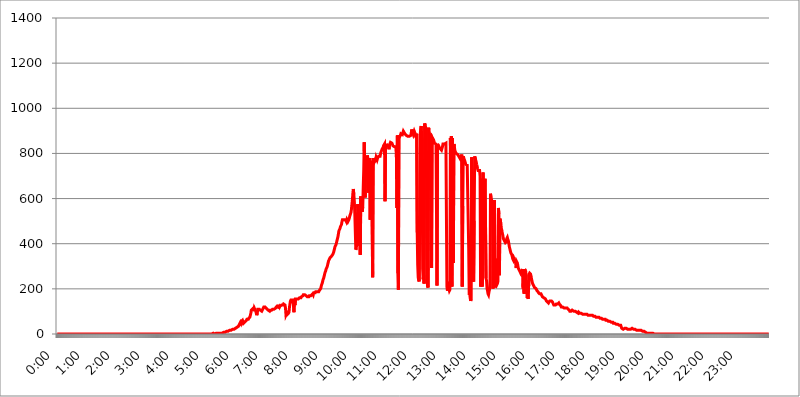
| Category | 2017.07.28. Intenzitás [W/m^2] |
|---|---|
| 0.0 | 0 |
| 0.0006944444444444445 | 0 |
| 0.001388888888888889 | 0 |
| 0.0020833333333333333 | 0 |
| 0.002777777777777778 | 0 |
| 0.003472222222222222 | 0 |
| 0.004166666666666667 | 0 |
| 0.004861111111111111 | 0 |
| 0.005555555555555556 | 0 |
| 0.0062499999999999995 | 0 |
| 0.006944444444444444 | 0 |
| 0.007638888888888889 | 0 |
| 0.008333333333333333 | 0 |
| 0.009027777777777779 | 0 |
| 0.009722222222222222 | 0 |
| 0.010416666666666666 | 0 |
| 0.011111111111111112 | 0 |
| 0.011805555555555555 | 0 |
| 0.012499999999999999 | 0 |
| 0.013194444444444444 | 0 |
| 0.013888888888888888 | 0 |
| 0.014583333333333332 | 0 |
| 0.015277777777777777 | 0 |
| 0.015972222222222224 | 0 |
| 0.016666666666666666 | 0 |
| 0.017361111111111112 | 0 |
| 0.018055555555555557 | 0 |
| 0.01875 | 0 |
| 0.019444444444444445 | 0 |
| 0.02013888888888889 | 0 |
| 0.020833333333333332 | 0 |
| 0.02152777777777778 | 0 |
| 0.022222222222222223 | 0 |
| 0.02291666666666667 | 0 |
| 0.02361111111111111 | 0 |
| 0.024305555555555556 | 0 |
| 0.024999999999999998 | 0 |
| 0.025694444444444447 | 0 |
| 0.02638888888888889 | 0 |
| 0.027083333333333334 | 0 |
| 0.027777777777777776 | 0 |
| 0.02847222222222222 | 0 |
| 0.029166666666666664 | 0 |
| 0.029861111111111113 | 0 |
| 0.030555555555555555 | 0 |
| 0.03125 | 0 |
| 0.03194444444444445 | 0 |
| 0.03263888888888889 | 0 |
| 0.03333333333333333 | 0 |
| 0.034027777777777775 | 0 |
| 0.034722222222222224 | 0 |
| 0.035416666666666666 | 0 |
| 0.036111111111111115 | 0 |
| 0.03680555555555556 | 0 |
| 0.0375 | 0 |
| 0.03819444444444444 | 0 |
| 0.03888888888888889 | 0 |
| 0.03958333333333333 | 0 |
| 0.04027777777777778 | 0 |
| 0.04097222222222222 | 0 |
| 0.041666666666666664 | 0 |
| 0.042361111111111106 | 0 |
| 0.04305555555555556 | 0 |
| 0.043750000000000004 | 0 |
| 0.044444444444444446 | 0 |
| 0.04513888888888889 | 0 |
| 0.04583333333333334 | 0 |
| 0.04652777777777778 | 0 |
| 0.04722222222222222 | 0 |
| 0.04791666666666666 | 0 |
| 0.04861111111111111 | 0 |
| 0.049305555555555554 | 0 |
| 0.049999999999999996 | 0 |
| 0.05069444444444445 | 0 |
| 0.051388888888888894 | 0 |
| 0.052083333333333336 | 0 |
| 0.05277777777777778 | 0 |
| 0.05347222222222222 | 0 |
| 0.05416666666666667 | 0 |
| 0.05486111111111111 | 0 |
| 0.05555555555555555 | 0 |
| 0.05625 | 0 |
| 0.05694444444444444 | 0 |
| 0.057638888888888885 | 0 |
| 0.05833333333333333 | 0 |
| 0.05902777777777778 | 0 |
| 0.059722222222222225 | 0 |
| 0.06041666666666667 | 0 |
| 0.061111111111111116 | 0 |
| 0.06180555555555556 | 0 |
| 0.0625 | 0 |
| 0.06319444444444444 | 0 |
| 0.06388888888888888 | 0 |
| 0.06458333333333334 | 0 |
| 0.06527777777777778 | 0 |
| 0.06597222222222222 | 0 |
| 0.06666666666666667 | 0 |
| 0.06736111111111111 | 0 |
| 0.06805555555555555 | 0 |
| 0.06874999999999999 | 0 |
| 0.06944444444444443 | 0 |
| 0.07013888888888889 | 0 |
| 0.07083333333333333 | 0 |
| 0.07152777777777779 | 0 |
| 0.07222222222222223 | 0 |
| 0.07291666666666667 | 0 |
| 0.07361111111111111 | 0 |
| 0.07430555555555556 | 0 |
| 0.075 | 0 |
| 0.07569444444444444 | 0 |
| 0.0763888888888889 | 0 |
| 0.07708333333333334 | 0 |
| 0.07777777777777778 | 0 |
| 0.07847222222222222 | 0 |
| 0.07916666666666666 | 0 |
| 0.0798611111111111 | 0 |
| 0.08055555555555556 | 0 |
| 0.08125 | 0 |
| 0.08194444444444444 | 0 |
| 0.08263888888888889 | 0 |
| 0.08333333333333333 | 0 |
| 0.08402777777777777 | 0 |
| 0.08472222222222221 | 0 |
| 0.08541666666666665 | 0 |
| 0.08611111111111112 | 0 |
| 0.08680555555555557 | 0 |
| 0.08750000000000001 | 0 |
| 0.08819444444444445 | 0 |
| 0.08888888888888889 | 0 |
| 0.08958333333333333 | 0 |
| 0.09027777777777778 | 0 |
| 0.09097222222222222 | 0 |
| 0.09166666666666667 | 0 |
| 0.09236111111111112 | 0 |
| 0.09305555555555556 | 0 |
| 0.09375 | 0 |
| 0.09444444444444444 | 0 |
| 0.09513888888888888 | 0 |
| 0.09583333333333333 | 0 |
| 0.09652777777777777 | 0 |
| 0.09722222222222222 | 0 |
| 0.09791666666666667 | 0 |
| 0.09861111111111111 | 0 |
| 0.09930555555555555 | 0 |
| 0.09999999999999999 | 0 |
| 0.10069444444444443 | 0 |
| 0.1013888888888889 | 0 |
| 0.10208333333333335 | 0 |
| 0.10277777777777779 | 0 |
| 0.10347222222222223 | 0 |
| 0.10416666666666667 | 0 |
| 0.10486111111111111 | 0 |
| 0.10555555555555556 | 0 |
| 0.10625 | 0 |
| 0.10694444444444444 | 0 |
| 0.1076388888888889 | 0 |
| 0.10833333333333334 | 0 |
| 0.10902777777777778 | 0 |
| 0.10972222222222222 | 0 |
| 0.1111111111111111 | 0 |
| 0.11180555555555556 | 0 |
| 0.11180555555555556 | 0 |
| 0.1125 | 0 |
| 0.11319444444444444 | 0 |
| 0.11388888888888889 | 0 |
| 0.11458333333333333 | 0 |
| 0.11527777777777777 | 0 |
| 0.11597222222222221 | 0 |
| 0.11666666666666665 | 0 |
| 0.1173611111111111 | 0 |
| 0.11805555555555557 | 0 |
| 0.11944444444444445 | 0 |
| 0.12013888888888889 | 0 |
| 0.12083333333333333 | 0 |
| 0.12152777777777778 | 0 |
| 0.12222222222222223 | 0 |
| 0.12291666666666667 | 0 |
| 0.12291666666666667 | 0 |
| 0.12361111111111112 | 0 |
| 0.12430555555555556 | 0 |
| 0.125 | 0 |
| 0.12569444444444444 | 0 |
| 0.12638888888888888 | 0 |
| 0.12708333333333333 | 0 |
| 0.16875 | 0 |
| 0.12847222222222224 | 0 |
| 0.12916666666666668 | 0 |
| 0.12986111111111112 | 0 |
| 0.13055555555555556 | 0 |
| 0.13125 | 0 |
| 0.13194444444444445 | 0 |
| 0.1326388888888889 | 0 |
| 0.13333333333333333 | 0 |
| 0.13402777777777777 | 0 |
| 0.13402777777777777 | 0 |
| 0.13472222222222222 | 0 |
| 0.13541666666666666 | 0 |
| 0.1361111111111111 | 0 |
| 0.13749999999999998 | 0 |
| 0.13819444444444443 | 0 |
| 0.1388888888888889 | 0 |
| 0.13958333333333334 | 0 |
| 0.14027777777777778 | 0 |
| 0.14097222222222222 | 0 |
| 0.14166666666666666 | 0 |
| 0.1423611111111111 | 0 |
| 0.14305555555555557 | 0 |
| 0.14375000000000002 | 0 |
| 0.14444444444444446 | 0 |
| 0.1451388888888889 | 0 |
| 0.1451388888888889 | 0 |
| 0.14652777777777778 | 0 |
| 0.14722222222222223 | 0 |
| 0.14791666666666667 | 0 |
| 0.1486111111111111 | 0 |
| 0.14930555555555555 | 0 |
| 0.15 | 0 |
| 0.15069444444444444 | 0 |
| 0.15138888888888888 | 0 |
| 0.15208333333333332 | 0 |
| 0.15277777777777776 | 0 |
| 0.15347222222222223 | 0 |
| 0.15416666666666667 | 0 |
| 0.15486111111111112 | 0 |
| 0.15555555555555556 | 0 |
| 0.15625 | 0 |
| 0.15694444444444444 | 0 |
| 0.15763888888888888 | 0 |
| 0.15833333333333333 | 0 |
| 0.15902777777777777 | 0 |
| 0.15972222222222224 | 0 |
| 0.16041666666666668 | 0 |
| 0.16111111111111112 | 0 |
| 0.16180555555555556 | 0 |
| 0.1625 | 0 |
| 0.16319444444444445 | 0 |
| 0.1638888888888889 | 0 |
| 0.16458333333333333 | 0 |
| 0.16527777777777777 | 0 |
| 0.16597222222222222 | 0 |
| 0.16666666666666666 | 0 |
| 0.1673611111111111 | 0 |
| 0.16805555555555554 | 0 |
| 0.16874999999999998 | 0 |
| 0.16944444444444443 | 0 |
| 0.17013888888888887 | 0 |
| 0.1708333333333333 | 0 |
| 0.17152777777777775 | 0 |
| 0.17222222222222225 | 0 |
| 0.1729166666666667 | 0 |
| 0.17361111111111113 | 0 |
| 0.17430555555555557 | 0 |
| 0.17500000000000002 | 0 |
| 0.17569444444444446 | 0 |
| 0.1763888888888889 | 0 |
| 0.17708333333333334 | 0 |
| 0.17777777777777778 | 0 |
| 0.17847222222222223 | 0 |
| 0.17916666666666667 | 0 |
| 0.1798611111111111 | 0 |
| 0.18055555555555555 | 0 |
| 0.18125 | 0 |
| 0.18194444444444444 | 0 |
| 0.1826388888888889 | 0 |
| 0.18333333333333335 | 0 |
| 0.1840277777777778 | 0 |
| 0.18472222222222223 | 0 |
| 0.18541666666666667 | 0 |
| 0.18611111111111112 | 0 |
| 0.18680555555555556 | 0 |
| 0.1875 | 0 |
| 0.18819444444444444 | 0 |
| 0.18888888888888888 | 0 |
| 0.18958333333333333 | 0 |
| 0.19027777777777777 | 0 |
| 0.1909722222222222 | 0 |
| 0.19166666666666665 | 0 |
| 0.19236111111111112 | 0 |
| 0.19305555555555554 | 0 |
| 0.19375 | 0 |
| 0.19444444444444445 | 0 |
| 0.1951388888888889 | 0 |
| 0.19583333333333333 | 0 |
| 0.19652777777777777 | 0 |
| 0.19722222222222222 | 0 |
| 0.19791666666666666 | 0 |
| 0.1986111111111111 | 0 |
| 0.19930555555555554 | 0 |
| 0.19999999999999998 | 0 |
| 0.20069444444444443 | 0 |
| 0.20138888888888887 | 0 |
| 0.2020833333333333 | 0 |
| 0.2027777777777778 | 0 |
| 0.2034722222222222 | 0 |
| 0.2041666666666667 | 0 |
| 0.20486111111111113 | 0 |
| 0.20555555555555557 | 0 |
| 0.20625000000000002 | 0 |
| 0.20694444444444446 | 0 |
| 0.2076388888888889 | 0 |
| 0.20833333333333334 | 0 |
| 0.20902777777777778 | 0 |
| 0.20972222222222223 | 0 |
| 0.21041666666666667 | 0 |
| 0.2111111111111111 | 0 |
| 0.21180555555555555 | 0 |
| 0.2125 | 0 |
| 0.21319444444444444 | 0 |
| 0.2138888888888889 | 0 |
| 0.21458333333333335 | 0 |
| 0.2152777777777778 | 0 |
| 0.21597222222222223 | 3.525 |
| 0.21666666666666667 | 0 |
| 0.21736111111111112 | 0 |
| 0.21805555555555556 | 0 |
| 0.21875 | 3.525 |
| 0.21944444444444444 | 3.525 |
| 0.22013888888888888 | 0 |
| 0.22083333333333333 | 0 |
| 0.22152777777777777 | 0 |
| 0.2222222222222222 | 0 |
| 0.22291666666666665 | 3.525 |
| 0.2236111111111111 | 3.525 |
| 0.22430555555555556 | 3.525 |
| 0.225 | 3.525 |
| 0.22569444444444445 | 3.525 |
| 0.2263888888888889 | 3.525 |
| 0.22708333333333333 | 3.525 |
| 0.22777777777777777 | 3.525 |
| 0.22847222222222222 | 3.525 |
| 0.22916666666666666 | 3.525 |
| 0.2298611111111111 | 3.525 |
| 0.23055555555555554 | 3.525 |
| 0.23124999999999998 | 3.525 |
| 0.23194444444444443 | 7.887 |
| 0.23263888888888887 | 7.887 |
| 0.2333333333333333 | 7.887 |
| 0.2340277777777778 | 7.887 |
| 0.2347222222222222 | 7.887 |
| 0.2354166666666667 | 7.887 |
| 0.23611111111111113 | 12.257 |
| 0.23680555555555557 | 12.257 |
| 0.23750000000000002 | 12.257 |
| 0.23819444444444446 | 12.257 |
| 0.2388888888888889 | 12.257 |
| 0.23958333333333334 | 12.257 |
| 0.24027777777777778 | 12.257 |
| 0.24097222222222223 | 12.257 |
| 0.24166666666666667 | 16.636 |
| 0.2423611111111111 | 16.636 |
| 0.24305555555555555 | 16.636 |
| 0.24375 | 16.636 |
| 0.24444444444444446 | 21.024 |
| 0.24513888888888888 | 21.024 |
| 0.24583333333333335 | 21.024 |
| 0.2465277777777778 | 21.024 |
| 0.24722222222222223 | 21.024 |
| 0.24791666666666667 | 21.024 |
| 0.24861111111111112 | 25.419 |
| 0.24930555555555556 | 25.419 |
| 0.25 | 25.419 |
| 0.25069444444444444 | 25.419 |
| 0.2513888888888889 | 29.823 |
| 0.2520833333333333 | 29.823 |
| 0.25277777777777777 | 29.823 |
| 0.2534722222222222 | 29.823 |
| 0.25416666666666665 | 34.234 |
| 0.2548611111111111 | 34.234 |
| 0.2555555555555556 | 43.079 |
| 0.25625000000000003 | 43.079 |
| 0.2569444444444445 | 51.951 |
| 0.2576388888888889 | 47.511 |
| 0.25833333333333336 | 56.398 |
| 0.2590277777777778 | 56.398 |
| 0.25972222222222224 | 60.85 |
| 0.2604166666666667 | 60.85 |
| 0.2611111111111111 | 47.511 |
| 0.26180555555555557 | 47.511 |
| 0.2625 | 51.951 |
| 0.26319444444444445 | 51.951 |
| 0.2638888888888889 | 56.398 |
| 0.26458333333333334 | 56.398 |
| 0.2652777777777778 | 60.85 |
| 0.2659722222222222 | 65.31 |
| 0.26666666666666666 | 65.31 |
| 0.2673611111111111 | 65.31 |
| 0.26805555555555555 | 65.31 |
| 0.26875 | 69.775 |
| 0.26944444444444443 | 69.775 |
| 0.2701388888888889 | 74.246 |
| 0.2708333333333333 | 83.205 |
| 0.27152777777777776 | 92.184 |
| 0.2722222222222222 | 105.69 |
| 0.27291666666666664 | 105.69 |
| 0.2736111111111111 | 110.201 |
| 0.2743055555555555 | 110.201 |
| 0.27499999999999997 | 114.716 |
| 0.27569444444444446 | 101.184 |
| 0.27638888888888885 | 114.716 |
| 0.27708333333333335 | 114.716 |
| 0.2777777777777778 | 114.716 |
| 0.27847222222222223 | 101.184 |
| 0.2791666666666667 | 92.184 |
| 0.2798611111111111 | 83.205 |
| 0.28055555555555556 | 92.184 |
| 0.28125 | 110.201 |
| 0.28194444444444444 | 110.201 |
| 0.2826388888888889 | 110.201 |
| 0.2833333333333333 | 110.201 |
| 0.28402777777777777 | 110.201 |
| 0.2847222222222222 | 105.69 |
| 0.28541666666666665 | 105.69 |
| 0.28611111111111115 | 105.69 |
| 0.28680555555555554 | 101.184 |
| 0.28750000000000003 | 105.69 |
| 0.2881944444444445 | 110.201 |
| 0.2888888888888889 | 114.716 |
| 0.28958333333333336 | 119.235 |
| 0.2902777777777778 | 119.235 |
| 0.29097222222222224 | 119.235 |
| 0.2916666666666667 | 119.235 |
| 0.2923611111111111 | 119.235 |
| 0.29305555555555557 | 114.716 |
| 0.29375 | 114.716 |
| 0.29444444444444445 | 110.201 |
| 0.2951388888888889 | 110.201 |
| 0.29583333333333334 | 105.69 |
| 0.2965277777777778 | 105.69 |
| 0.2972222222222222 | 105.69 |
| 0.29791666666666666 | 101.184 |
| 0.2986111111111111 | 105.69 |
| 0.29930555555555555 | 105.69 |
| 0.3 | 105.69 |
| 0.30069444444444443 | 105.69 |
| 0.3013888888888889 | 105.69 |
| 0.3020833333333333 | 110.201 |
| 0.30277777777777776 | 110.201 |
| 0.3034722222222222 | 110.201 |
| 0.30416666666666664 | 110.201 |
| 0.3048611111111111 | 110.201 |
| 0.3055555555555555 | 110.201 |
| 0.30624999999999997 | 114.716 |
| 0.3069444444444444 | 119.235 |
| 0.3076388888888889 | 119.235 |
| 0.30833333333333335 | 123.758 |
| 0.3090277777777778 | 123.758 |
| 0.30972222222222223 | 119.235 |
| 0.3104166666666667 | 119.235 |
| 0.3111111111111111 | 123.758 |
| 0.31180555555555556 | 119.235 |
| 0.3125 | 123.758 |
| 0.31319444444444444 | 123.758 |
| 0.3138888888888889 | 123.758 |
| 0.3145833333333333 | 128.284 |
| 0.31527777777777777 | 128.284 |
| 0.3159722222222222 | 128.284 |
| 0.31666666666666665 | 128.284 |
| 0.31736111111111115 | 132.814 |
| 0.31805555555555554 | 132.814 |
| 0.31875000000000003 | 132.814 |
| 0.3194444444444445 | 128.284 |
| 0.3201388888888889 | 114.716 |
| 0.32083333333333336 | 83.205 |
| 0.3215277777777778 | 87.692 |
| 0.32222222222222224 | 92.184 |
| 0.3229166666666667 | 87.692 |
| 0.3236111111111111 | 87.692 |
| 0.32430555555555557 | 92.184 |
| 0.325 | 96.682 |
| 0.32569444444444445 | 119.235 |
| 0.3263888888888889 | 119.235 |
| 0.32708333333333334 | 146.423 |
| 0.3277777777777778 | 150.964 |
| 0.3284722222222222 | 150.964 |
| 0.32916666666666666 | 150.964 |
| 0.3298611111111111 | 150.964 |
| 0.33055555555555555 | 150.964 |
| 0.33125 | 132.814 |
| 0.33194444444444443 | 96.682 |
| 0.3326388888888889 | 155.509 |
| 0.3333333333333333 | 128.284 |
| 0.3340277777777778 | 155.509 |
| 0.3347222222222222 | 155.509 |
| 0.3354166666666667 | 155.509 |
| 0.3361111111111111 | 155.509 |
| 0.3368055555555556 | 155.509 |
| 0.33749999999999997 | 155.509 |
| 0.33819444444444446 | 155.509 |
| 0.33888888888888885 | 155.509 |
| 0.33958333333333335 | 160.056 |
| 0.34027777777777773 | 160.056 |
| 0.34097222222222223 | 160.056 |
| 0.3416666666666666 | 160.056 |
| 0.3423611111111111 | 164.605 |
| 0.3430555555555555 | 164.605 |
| 0.34375 | 164.605 |
| 0.3444444444444445 | 169.156 |
| 0.3451388888888889 | 173.709 |
| 0.3458333333333334 | 173.709 |
| 0.34652777777777777 | 173.709 |
| 0.34722222222222227 | 173.709 |
| 0.34791666666666665 | 173.709 |
| 0.34861111111111115 | 173.709 |
| 0.34930555555555554 | 169.156 |
| 0.35000000000000003 | 169.156 |
| 0.3506944444444444 | 164.605 |
| 0.3513888888888889 | 164.605 |
| 0.3520833333333333 | 164.605 |
| 0.3527777777777778 | 164.605 |
| 0.3534722222222222 | 169.156 |
| 0.3541666666666667 | 169.156 |
| 0.3548611111111111 | 169.156 |
| 0.35555555555555557 | 169.156 |
| 0.35625 | 169.156 |
| 0.35694444444444445 | 173.709 |
| 0.3576388888888889 | 173.709 |
| 0.35833333333333334 | 178.264 |
| 0.3590277777777778 | 173.709 |
| 0.3597222222222222 | 182.82 |
| 0.36041666666666666 | 182.82 |
| 0.3611111111111111 | 182.82 |
| 0.36180555555555555 | 182.82 |
| 0.3625 | 187.378 |
| 0.36319444444444443 | 187.378 |
| 0.3638888888888889 | 187.378 |
| 0.3645833333333333 | 187.378 |
| 0.3652777777777778 | 187.378 |
| 0.3659722222222222 | 187.378 |
| 0.3666666666666667 | 187.378 |
| 0.3673611111111111 | 191.937 |
| 0.3680555555555556 | 191.937 |
| 0.36874999999999997 | 191.937 |
| 0.36944444444444446 | 201.058 |
| 0.37013888888888885 | 210.182 |
| 0.37083333333333335 | 219.309 |
| 0.37152777777777773 | 223.873 |
| 0.37222222222222223 | 233 |
| 0.3729166666666666 | 242.127 |
| 0.3736111111111111 | 246.689 |
| 0.3743055555555555 | 255.813 |
| 0.375 | 264.932 |
| 0.3756944444444445 | 274.047 |
| 0.3763888888888889 | 278.603 |
| 0.3770833333333334 | 287.709 |
| 0.37777777777777777 | 292.259 |
| 0.37847222222222227 | 296.808 |
| 0.37916666666666665 | 305.898 |
| 0.37986111111111115 | 314.98 |
| 0.38055555555555554 | 324.052 |
| 0.38125000000000003 | 328.584 |
| 0.3819444444444444 | 333.113 |
| 0.3826388888888889 | 337.639 |
| 0.3833333333333333 | 337.639 |
| 0.3840277777777778 | 342.162 |
| 0.3847222222222222 | 342.162 |
| 0.3854166666666667 | 342.162 |
| 0.3861111111111111 | 351.198 |
| 0.38680555555555557 | 355.712 |
| 0.3875 | 360.221 |
| 0.38819444444444445 | 369.23 |
| 0.3888888888888889 | 378.224 |
| 0.38958333333333334 | 387.202 |
| 0.3902777777777778 | 391.685 |
| 0.3909722222222222 | 396.164 |
| 0.39166666666666666 | 405.108 |
| 0.3923611111111111 | 414.035 |
| 0.39305555555555555 | 422.943 |
| 0.39375 | 431.833 |
| 0.39444444444444443 | 445.129 |
| 0.3951388888888889 | 458.38 |
| 0.3958333333333333 | 462.786 |
| 0.3965277777777778 | 467.187 |
| 0.3972222222222222 | 475.972 |
| 0.3979166666666667 | 480.356 |
| 0.3986111111111111 | 484.735 |
| 0.3993055555555556 | 497.836 |
| 0.39999999999999997 | 506.542 |
| 0.40069444444444446 | 510.885 |
| 0.40138888888888885 | 506.542 |
| 0.40208333333333335 | 506.542 |
| 0.40277777777777773 | 506.542 |
| 0.40347222222222223 | 506.542 |
| 0.4041666666666666 | 506.542 |
| 0.4048611111111111 | 502.192 |
| 0.4055555555555555 | 497.836 |
| 0.40625 | 506.542 |
| 0.4069444444444445 | 502.192 |
| 0.4076388888888889 | 497.836 |
| 0.4083333333333334 | 497.836 |
| 0.40902777777777777 | 506.542 |
| 0.40972222222222227 | 515.223 |
| 0.41041666666666665 | 523.88 |
| 0.41111111111111115 | 528.2 |
| 0.41180555555555554 | 536.82 |
| 0.41250000000000003 | 549.704 |
| 0.4131944444444444 | 571.049 |
| 0.4138888888888889 | 592.233 |
| 0.4145833333333333 | 621.613 |
| 0.4152777777777778 | 642.4 |
| 0.4159722222222222 | 617.436 |
| 0.4166666666666667 | 588.009 |
| 0.4173611111111111 | 532.513 |
| 0.41805555555555557 | 536.82 |
| 0.41875 | 373.729 |
| 0.41944444444444445 | 378.224 |
| 0.4201388888888889 | 427.39 |
| 0.42083333333333334 | 467.187 |
| 0.4215277777777778 | 575.299 |
| 0.4222222222222222 | 467.187 |
| 0.42291666666666666 | 391.685 |
| 0.4236111111111111 | 493.475 |
| 0.42430555555555555 | 532.513 |
| 0.425 | 351.198 |
| 0.42569444444444443 | 609.062 |
| 0.4263888888888889 | 562.53 |
| 0.4270833333333333 | 549.704 |
| 0.4277777777777778 | 541.121 |
| 0.4284722222222222 | 562.53 |
| 0.4291666666666667 | 650.667 |
| 0.4298611111111111 | 727.896 |
| 0.4305555555555556 | 849.199 |
| 0.43124999999999997 | 719.877 |
| 0.43194444444444446 | 604.864 |
| 0.43263888888888885 | 783.342 |
| 0.43333333333333335 | 743.859 |
| 0.43402777777777773 | 771.559 |
| 0.43472222222222223 | 791.169 |
| 0.4354166666666666 | 783.342 |
| 0.4361111111111111 | 779.42 |
| 0.4368055555555555 | 625.784 |
| 0.4375 | 779.42 |
| 0.4381944444444445 | 687.544 |
| 0.4388888888888889 | 506.542 |
| 0.4395833333333334 | 755.766 |
| 0.44027777777777777 | 755.766 |
| 0.44097222222222227 | 767.62 |
| 0.44166666666666665 | 771.559 |
| 0.44236111111111115 | 251.251 |
| 0.44305555555555554 | 779.42 |
| 0.44375000000000003 | 767.62 |
| 0.4444444444444444 | 759.723 |
| 0.4451388888888889 | 759.723 |
| 0.4458333333333333 | 755.766 |
| 0.4465277777777778 | 771.559 |
| 0.4472222222222222 | 783.342 |
| 0.4479166666666667 | 779.42 |
| 0.4486111111111111 | 771.559 |
| 0.44930555555555557 | 779.42 |
| 0.45 | 783.342 |
| 0.45069444444444445 | 787.258 |
| 0.4513888888888889 | 783.342 |
| 0.45208333333333334 | 783.342 |
| 0.4527777777777778 | 787.258 |
| 0.4534722222222222 | 798.974 |
| 0.45416666666666666 | 806.757 |
| 0.4548611111111111 | 810.641 |
| 0.45555555555555555 | 818.392 |
| 0.45625 | 822.26 |
| 0.45694444444444443 | 826.123 |
| 0.4576388888888889 | 833.834 |
| 0.4583333333333333 | 837.682 |
| 0.4590277777777778 | 841.526 |
| 0.4597222222222222 | 588.009 |
| 0.4604166666666667 | 833.834 |
| 0.4611111111111111 | 829.981 |
| 0.4618055555555556 | 829.981 |
| 0.46249999999999997 | 837.682 |
| 0.46319444444444446 | 833.834 |
| 0.46388888888888885 | 837.682 |
| 0.46458333333333335 | 829.981 |
| 0.46527777777777773 | 818.392 |
| 0.46597222222222223 | 837.682 |
| 0.4666666666666666 | 837.682 |
| 0.4673611111111111 | 849.199 |
| 0.4680555555555555 | 845.365 |
| 0.46875 | 845.365 |
| 0.4694444444444445 | 845.365 |
| 0.4701388888888889 | 841.526 |
| 0.4708333333333334 | 833.834 |
| 0.47152777777777777 | 837.682 |
| 0.47222222222222227 | 833.834 |
| 0.47291666666666665 | 829.981 |
| 0.47361111111111115 | 829.981 |
| 0.47430555555555554 | 829.981 |
| 0.47500000000000003 | 829.981 |
| 0.4756944444444444 | 779.42 |
| 0.4763888888888889 | 558.261 |
| 0.4770833333333333 | 879.719 |
| 0.4777777777777778 | 269.49 |
| 0.4784722222222222 | 196.497 |
| 0.4791666666666667 | 879.719 |
| 0.4798611111111111 | 872.114 |
| 0.48055555555555557 | 875.918 |
| 0.48125 | 879.719 |
| 0.48194444444444445 | 887.309 |
| 0.4826388888888889 | 887.309 |
| 0.48333333333333334 | 883.516 |
| 0.4840277777777778 | 883.516 |
| 0.4847222222222222 | 891.099 |
| 0.48541666666666666 | 898.668 |
| 0.4861111111111111 | 894.885 |
| 0.48680555555555555 | 894.885 |
| 0.4875 | 887.309 |
| 0.48819444444444443 | 887.309 |
| 0.4888888888888889 | 883.516 |
| 0.4895833333333333 | 879.719 |
| 0.4902777777777778 | 875.918 |
| 0.4909722222222222 | 875.918 |
| 0.4916666666666667 | 875.918 |
| 0.4923611111111111 | 875.918 |
| 0.4930555555555556 | 872.114 |
| 0.49374999999999997 | 875.918 |
| 0.49444444444444446 | 875.918 |
| 0.49513888888888885 | 875.918 |
| 0.49583333333333335 | 879.719 |
| 0.49652777777777773 | 891.099 |
| 0.49722222222222223 | 906.223 |
| 0.4979166666666666 | 894.885 |
| 0.4986111111111111 | 891.099 |
| 0.4993055555555555 | 883.516 |
| 0.5 | 891.099 |
| 0.5006944444444444 | 898.668 |
| 0.5013888888888889 | 894.885 |
| 0.5020833333333333 | 887.309 |
| 0.5027777777777778 | 883.516 |
| 0.5034722222222222 | 868.305 |
| 0.5041666666666667 | 887.309 |
| 0.5048611111111111 | 449.551 |
| 0.5055555555555555 | 305.898 |
| 0.50625 | 251.251 |
| 0.5069444444444444 | 237.564 |
| 0.5076388888888889 | 233 |
| 0.5083333333333333 | 523.88 |
| 0.5090277777777777 | 879.719 |
| 0.5097222222222222 | 909.996 |
| 0.5104166666666666 | 921.298 |
| 0.5111111111111112 | 925.06 |
| 0.5118055555555555 | 818.392 |
| 0.5125000000000001 | 287.709 |
| 0.5131944444444444 | 242.127 |
| 0.513888888888889 | 260.373 |
| 0.5145833333333333 | 223.873 |
| 0.5152777777777778 | 932.576 |
| 0.5159722222222222 | 925.06 |
| 0.5166666666666667 | 925.06 |
| 0.517361111111111 | 906.223 |
| 0.5180555555555556 | 739.877 |
| 0.5187499999999999 | 242.127 |
| 0.5194444444444445 | 210.182 |
| 0.5201388888888888 | 205.62 |
| 0.5208333333333334 | 913.766 |
| 0.5215277777777778 | 913.766 |
| 0.5222222222222223 | 909.996 |
| 0.5229166666666667 | 826.123 |
| 0.5236111111111111 | 887.309 |
| 0.5243055555555556 | 872.114 |
| 0.525 | 292.259 |
| 0.5256944444444445 | 872.114 |
| 0.5263888888888889 | 872.114 |
| 0.5270833333333333 | 868.305 |
| 0.5277777777777778 | 860.676 |
| 0.5284722222222222 | 856.855 |
| 0.5291666666666667 | 845.365 |
| 0.5298611111111111 | 845.365 |
| 0.5305555555555556 | 845.365 |
| 0.53125 | 841.526 |
| 0.5319444444444444 | 845.365 |
| 0.5326388888888889 | 214.746 |
| 0.5333333333333333 | 841.526 |
| 0.5340277777777778 | 837.682 |
| 0.5347222222222222 | 837.682 |
| 0.5354166666666667 | 829.981 |
| 0.5361111111111111 | 826.123 |
| 0.5368055555555555 | 822.26 |
| 0.5375 | 818.392 |
| 0.5381944444444444 | 818.392 |
| 0.5388888888888889 | 814.519 |
| 0.5395833333333333 | 818.392 |
| 0.5402777777777777 | 829.981 |
| 0.5409722222222222 | 841.526 |
| 0.5416666666666666 | 837.682 |
| 0.5423611111111112 | 841.526 |
| 0.5430555555555555 | 841.526 |
| 0.5437500000000001 | 845.365 |
| 0.5444444444444444 | 845.365 |
| 0.545138888888889 | 845.365 |
| 0.5458333333333333 | 849.199 |
| 0.5465277777777778 | 210.182 |
| 0.5472222222222222 | 191.937 |
| 0.5479166666666667 | 214.746 |
| 0.548611111111111 | 219.309 |
| 0.5493055555555556 | 201.058 |
| 0.5499999999999999 | 191.937 |
| 0.5506944444444445 | 196.497 |
| 0.5513888888888888 | 868.305 |
| 0.5520833333333334 | 675.311 |
| 0.5527777777777778 | 875.918 |
| 0.5534722222222223 | 210.182 |
| 0.5541666666666667 | 868.305 |
| 0.5548611111111111 | 872.114 |
| 0.5555555555555556 | 314.98 |
| 0.55625 | 841.526 |
| 0.5569444444444445 | 829.981 |
| 0.5576388888888889 | 814.519 |
| 0.5583333333333333 | 806.757 |
| 0.5590277777777778 | 806.757 |
| 0.5597222222222222 | 798.974 |
| 0.5604166666666667 | 798.974 |
| 0.5611111111111111 | 795.074 |
| 0.5618055555555556 | 795.074 |
| 0.5625 | 795.074 |
| 0.5631944444444444 | 791.169 |
| 0.5638888888888889 | 783.342 |
| 0.5645833333333333 | 779.42 |
| 0.5652777777777778 | 775.492 |
| 0.5659722222222222 | 771.559 |
| 0.5666666666666667 | 783.342 |
| 0.5673611111111111 | 795.074 |
| 0.5680555555555555 | 210.182 |
| 0.56875 | 566.793 |
| 0.5694444444444444 | 787.258 |
| 0.5701388888888889 | 779.42 |
| 0.5708333333333333 | 775.492 |
| 0.5715277777777777 | 767.62 |
| 0.5722222222222222 | 759.723 |
| 0.5729166666666666 | 751.803 |
| 0.5736111111111112 | 751.803 |
| 0.5743055555555555 | 751.803 |
| 0.5750000000000001 | 747.834 |
| 0.5756944444444444 | 751.803 |
| 0.576388888888889 | 751.803 |
| 0.5770833333333333 | 378.224 |
| 0.5777777777777778 | 173.709 |
| 0.5784722222222222 | 178.264 |
| 0.5791666666666667 | 160.056 |
| 0.579861111111111 | 146.423 |
| 0.5805555555555556 | 155.509 |
| 0.5812499999999999 | 783.342 |
| 0.5819444444444445 | 246.689 |
| 0.5826388888888888 | 233 |
| 0.5833333333333334 | 260.373 |
| 0.5840277777777778 | 233 |
| 0.5847222222222223 | 502.192 |
| 0.5854166666666667 | 787.258 |
| 0.5861111111111111 | 783.342 |
| 0.5868055555555556 | 771.559 |
| 0.5875 | 763.674 |
| 0.5881944444444445 | 751.803 |
| 0.5888888888888889 | 743.859 |
| 0.5895833333333333 | 731.896 |
| 0.5902777777777778 | 723.889 |
| 0.5909722222222222 | 723.889 |
| 0.5916666666666667 | 727.896 |
| 0.5923611111111111 | 723.889 |
| 0.5930555555555556 | 699.717 |
| 0.59375 | 210.182 |
| 0.5944444444444444 | 210.182 |
| 0.5951388888888889 | 687.544 |
| 0.5958333333333333 | 210.182 |
| 0.5965277777777778 | 251.251 |
| 0.5972222222222222 | 715.858 |
| 0.5979166666666667 | 515.223 |
| 0.5986111111111111 | 414.035 |
| 0.5993055555555555 | 634.105 |
| 0.6 | 687.544 |
| 0.6006944444444444 | 691.608 |
| 0.6013888888888889 | 246.689 |
| 0.6020833333333333 | 237.564 |
| 0.6027777777777777 | 201.058 |
| 0.6034722222222222 | 191.937 |
| 0.6041666666666666 | 178.264 |
| 0.6048611111111112 | 173.709 |
| 0.6055555555555555 | 187.378 |
| 0.6062500000000001 | 187.378 |
| 0.6069444444444444 | 205.62 |
| 0.607638888888889 | 621.613 |
| 0.6083333333333333 | 604.864 |
| 0.6090277777777778 | 596.45 |
| 0.6097222222222222 | 583.779 |
| 0.6104166666666667 | 575.299 |
| 0.611111111111111 | 201.058 |
| 0.6118055555555556 | 400.638 |
| 0.6124999999999999 | 364.728 |
| 0.6131944444444445 | 592.233 |
| 0.6138888888888888 | 219.309 |
| 0.6145833333333334 | 205.62 |
| 0.6152777777777778 | 333.113 |
| 0.6159722222222223 | 228.436 |
| 0.6166666666666667 | 219.309 |
| 0.6173611111111111 | 223.873 |
| 0.6180555555555556 | 233 |
| 0.61875 | 558.261 |
| 0.6194444444444445 | 532.513 |
| 0.6201388888888889 | 260.373 |
| 0.6208333333333333 | 510.885 |
| 0.6215277777777778 | 506.542 |
| 0.6222222222222222 | 489.108 |
| 0.6229166666666667 | 467.187 |
| 0.6236111111111111 | 458.38 |
| 0.6243055555555556 | 445.129 |
| 0.625 | 436.27 |
| 0.6256944444444444 | 422.943 |
| 0.6263888888888889 | 418.492 |
| 0.6270833333333333 | 414.035 |
| 0.6277777777777778 | 409.574 |
| 0.6284722222222222 | 405.108 |
| 0.6291666666666667 | 405.108 |
| 0.6298611111111111 | 409.574 |
| 0.6305555555555555 | 422.943 |
| 0.63125 | 427.39 |
| 0.6319444444444444 | 418.492 |
| 0.6326388888888889 | 414.035 |
| 0.6333333333333333 | 400.638 |
| 0.6340277777777777 | 387.202 |
| 0.6347222222222222 | 378.224 |
| 0.6354166666666666 | 369.23 |
| 0.6361111111111112 | 360.221 |
| 0.6368055555555555 | 355.712 |
| 0.6375000000000001 | 351.198 |
| 0.6381944444444444 | 342.162 |
| 0.638888888888889 | 333.113 |
| 0.6395833333333333 | 328.584 |
| 0.6402777777777778 | 337.639 |
| 0.6409722222222222 | 337.639 |
| 0.6416666666666667 | 337.639 |
| 0.642361111111111 | 324.052 |
| 0.6430555555555556 | 310.44 |
| 0.6437499999999999 | 292.259 |
| 0.6444444444444445 | 319.517 |
| 0.6451388888888888 | 314.98 |
| 0.6458333333333334 | 305.898 |
| 0.6465277777777778 | 292.259 |
| 0.6472222222222223 | 287.709 |
| 0.6479166666666667 | 283.156 |
| 0.6486111111111111 | 278.603 |
| 0.6493055555555556 | 274.047 |
| 0.65 | 269.49 |
| 0.6506944444444445 | 269.49 |
| 0.6513888888888889 | 269.49 |
| 0.6520833333333333 | 283.156 |
| 0.6527777777777778 | 287.709 |
| 0.6534722222222222 | 201.058 |
| 0.6541666666666667 | 255.813 |
| 0.6548611111111111 | 178.264 |
| 0.6555555555555556 | 287.709 |
| 0.65625 | 283.156 |
| 0.6569444444444444 | 278.603 |
| 0.6576388888888889 | 260.373 |
| 0.6583333333333333 | 210.182 |
| 0.6590277777777778 | 160.056 |
| 0.6597222222222222 | 164.605 |
| 0.6604166666666667 | 155.509 |
| 0.6611111111111111 | 155.509 |
| 0.6618055555555555 | 264.932 |
| 0.6625 | 269.49 |
| 0.6631944444444444 | 269.49 |
| 0.6638888888888889 | 264.932 |
| 0.6645833333333333 | 255.813 |
| 0.6652777777777777 | 242.127 |
| 0.6659722222222222 | 233 |
| 0.6666666666666666 | 223.873 |
| 0.6673611111111111 | 219.309 |
| 0.6680555555555556 | 214.746 |
| 0.6687500000000001 | 210.182 |
| 0.6694444444444444 | 205.62 |
| 0.6701388888888888 | 205.62 |
| 0.6708333333333334 | 205.62 |
| 0.6715277777777778 | 201.058 |
| 0.6722222222222222 | 196.497 |
| 0.6729166666666666 | 191.937 |
| 0.6736111111111112 | 191.937 |
| 0.6743055555555556 | 187.378 |
| 0.6749999999999999 | 182.82 |
| 0.6756944444444444 | 182.82 |
| 0.6763888888888889 | 178.264 |
| 0.6770833333333334 | 178.264 |
| 0.6777777777777777 | 178.264 |
| 0.6784722222222223 | 178.264 |
| 0.6791666666666667 | 173.709 |
| 0.6798611111111111 | 173.709 |
| 0.6805555555555555 | 164.605 |
| 0.68125 | 164.605 |
| 0.6819444444444445 | 164.605 |
| 0.6826388888888889 | 160.056 |
| 0.6833333333333332 | 160.056 |
| 0.6840277777777778 | 160.056 |
| 0.6847222222222222 | 155.509 |
| 0.6854166666666667 | 150.964 |
| 0.686111111111111 | 146.423 |
| 0.6868055555555556 | 146.423 |
| 0.6875 | 141.884 |
| 0.6881944444444444 | 141.884 |
| 0.688888888888889 | 137.347 |
| 0.6895833333333333 | 141.884 |
| 0.6902777777777778 | 141.884 |
| 0.6909722222222222 | 146.423 |
| 0.6916666666666668 | 146.423 |
| 0.6923611111111111 | 146.423 |
| 0.6930555555555555 | 146.423 |
| 0.69375 | 146.423 |
| 0.6944444444444445 | 141.884 |
| 0.6951388888888889 | 137.347 |
| 0.6958333333333333 | 132.814 |
| 0.6965277777777777 | 128.284 |
| 0.6972222222222223 | 128.284 |
| 0.6979166666666666 | 128.284 |
| 0.6986111111111111 | 128.284 |
| 0.6993055555555556 | 128.284 |
| 0.7000000000000001 | 132.814 |
| 0.7006944444444444 | 132.814 |
| 0.7013888888888888 | 132.814 |
| 0.7020833333333334 | 132.814 |
| 0.7027777777777778 | 132.814 |
| 0.7034722222222222 | 137.347 |
| 0.7041666666666666 | 132.814 |
| 0.7048611111111112 | 132.814 |
| 0.7055555555555556 | 128.284 |
| 0.7062499999999999 | 123.758 |
| 0.7069444444444444 | 119.235 |
| 0.7076388888888889 | 119.235 |
| 0.7083333333333334 | 119.235 |
| 0.7090277777777777 | 119.235 |
| 0.7097222222222223 | 119.235 |
| 0.7104166666666667 | 119.235 |
| 0.7111111111111111 | 114.716 |
| 0.7118055555555555 | 114.716 |
| 0.7125 | 114.716 |
| 0.7131944444444445 | 114.716 |
| 0.7138888888888889 | 114.716 |
| 0.7145833333333332 | 114.716 |
| 0.7152777777777778 | 114.716 |
| 0.7159722222222222 | 114.716 |
| 0.7166666666666667 | 110.201 |
| 0.717361111111111 | 110.201 |
| 0.7180555555555556 | 105.69 |
| 0.71875 | 101.184 |
| 0.7194444444444444 | 101.184 |
| 0.720138888888889 | 101.184 |
| 0.7208333333333333 | 101.184 |
| 0.7215277777777778 | 101.184 |
| 0.7222222222222222 | 105.69 |
| 0.7229166666666668 | 105.69 |
| 0.7236111111111111 | 105.69 |
| 0.7243055555555555 | 101.184 |
| 0.725 | 101.184 |
| 0.7256944444444445 | 101.184 |
| 0.7263888888888889 | 101.184 |
| 0.7270833333333333 | 101.184 |
| 0.7277777777777777 | 101.184 |
| 0.7284722222222223 | 96.682 |
| 0.7291666666666666 | 96.682 |
| 0.7298611111111111 | 96.682 |
| 0.7305555555555556 | 92.184 |
| 0.7312500000000001 | 96.682 |
| 0.7319444444444444 | 96.682 |
| 0.7326388888888888 | 92.184 |
| 0.7333333333333334 | 92.184 |
| 0.7340277777777778 | 92.184 |
| 0.7347222222222222 | 92.184 |
| 0.7354166666666666 | 92.184 |
| 0.7361111111111112 | 92.184 |
| 0.7368055555555556 | 87.692 |
| 0.7374999999999999 | 87.692 |
| 0.7381944444444444 | 87.692 |
| 0.7388888888888889 | 87.692 |
| 0.7395833333333334 | 87.692 |
| 0.7402777777777777 | 87.692 |
| 0.7409722222222223 | 87.692 |
| 0.7416666666666667 | 87.692 |
| 0.7423611111111111 | 87.692 |
| 0.7430555555555555 | 87.692 |
| 0.74375 | 87.692 |
| 0.7444444444444445 | 83.205 |
| 0.7451388888888889 | 83.205 |
| 0.7458333333333332 | 83.205 |
| 0.7465277777777778 | 83.205 |
| 0.7472222222222222 | 83.205 |
| 0.7479166666666667 | 83.205 |
| 0.748611111111111 | 83.205 |
| 0.7493055555555556 | 83.205 |
| 0.75 | 83.205 |
| 0.7506944444444444 | 83.205 |
| 0.751388888888889 | 83.205 |
| 0.7520833333333333 | 78.722 |
| 0.7527777777777778 | 78.722 |
| 0.7534722222222222 | 78.722 |
| 0.7541666666666668 | 78.722 |
| 0.7548611111111111 | 78.722 |
| 0.7555555555555555 | 74.246 |
| 0.75625 | 74.246 |
| 0.7569444444444445 | 74.246 |
| 0.7576388888888889 | 74.246 |
| 0.7583333333333333 | 74.246 |
| 0.7590277777777777 | 74.246 |
| 0.7597222222222223 | 74.246 |
| 0.7604166666666666 | 74.246 |
| 0.7611111111111111 | 69.775 |
| 0.7618055555555556 | 69.775 |
| 0.7625000000000001 | 69.775 |
| 0.7631944444444444 | 69.775 |
| 0.7638888888888888 | 69.775 |
| 0.7645833333333334 | 65.31 |
| 0.7652777777777778 | 65.31 |
| 0.7659722222222222 | 65.31 |
| 0.7666666666666666 | 65.31 |
| 0.7673611111111112 | 65.31 |
| 0.7680555555555556 | 65.31 |
| 0.7687499999999999 | 65.31 |
| 0.7694444444444444 | 60.85 |
| 0.7701388888888889 | 60.85 |
| 0.7708333333333334 | 60.85 |
| 0.7715277777777777 | 60.85 |
| 0.7722222222222223 | 60.85 |
| 0.7729166666666667 | 56.398 |
| 0.7736111111111111 | 56.398 |
| 0.7743055555555555 | 56.398 |
| 0.775 | 56.398 |
| 0.7756944444444445 | 56.398 |
| 0.7763888888888889 | 56.398 |
| 0.7770833333333332 | 51.951 |
| 0.7777777777777778 | 51.951 |
| 0.7784722222222222 | 51.951 |
| 0.7791666666666667 | 51.951 |
| 0.779861111111111 | 47.511 |
| 0.7805555555555556 | 47.511 |
| 0.78125 | 47.511 |
| 0.7819444444444444 | 47.511 |
| 0.782638888888889 | 47.511 |
| 0.7833333333333333 | 47.511 |
| 0.7840277777777778 | 43.079 |
| 0.7847222222222222 | 43.079 |
| 0.7854166666666668 | 43.079 |
| 0.7861111111111111 | 43.079 |
| 0.7868055555555555 | 38.653 |
| 0.7875 | 38.653 |
| 0.7881944444444445 | 38.653 |
| 0.7888888888888889 | 38.653 |
| 0.7895833333333333 | 38.653 |
| 0.7902777777777777 | 38.653 |
| 0.7909722222222223 | 34.234 |
| 0.7916666666666666 | 25.419 |
| 0.7923611111111111 | 25.419 |
| 0.7930555555555556 | 21.024 |
| 0.7937500000000001 | 21.024 |
| 0.7944444444444444 | 25.419 |
| 0.7951388888888888 | 25.419 |
| 0.7958333333333334 | 25.419 |
| 0.7965277777777778 | 25.419 |
| 0.7972222222222222 | 21.024 |
| 0.7979166666666666 | 25.419 |
| 0.7986111111111112 | 21.024 |
| 0.7993055555555556 | 21.024 |
| 0.7999999999999999 | 21.024 |
| 0.8006944444444444 | 21.024 |
| 0.8013888888888889 | 21.024 |
| 0.8020833333333334 | 21.024 |
| 0.8027777777777777 | 25.419 |
| 0.8034722222222223 | 25.419 |
| 0.8041666666666667 | 21.024 |
| 0.8048611111111111 | 21.024 |
| 0.8055555555555555 | 25.419 |
| 0.80625 | 25.419 |
| 0.8069444444444445 | 21.024 |
| 0.8076388888888889 | 21.024 |
| 0.8083333333333332 | 21.024 |
| 0.8090277777777778 | 21.024 |
| 0.8097222222222222 | 21.024 |
| 0.8104166666666667 | 21.024 |
| 0.811111111111111 | 16.636 |
| 0.8118055555555556 | 16.636 |
| 0.8125 | 16.636 |
| 0.8131944444444444 | 16.636 |
| 0.813888888888889 | 16.636 |
| 0.8145833333333333 | 16.636 |
| 0.8152777777777778 | 16.636 |
| 0.8159722222222222 | 16.636 |
| 0.8166666666666668 | 16.636 |
| 0.8173611111111111 | 16.636 |
| 0.8180555555555555 | 16.636 |
| 0.81875 | 16.636 |
| 0.8194444444444445 | 16.636 |
| 0.8201388888888889 | 16.636 |
| 0.8208333333333333 | 12.257 |
| 0.8215277777777777 | 12.257 |
| 0.8222222222222223 | 12.257 |
| 0.8229166666666666 | 12.257 |
| 0.8236111111111111 | 12.257 |
| 0.8243055555555556 | 7.887 |
| 0.8250000000000001 | 7.887 |
| 0.8256944444444444 | 7.887 |
| 0.8263888888888888 | 3.525 |
| 0.8270833333333334 | 3.525 |
| 0.8277777777777778 | 3.525 |
| 0.8284722222222222 | 3.525 |
| 0.8291666666666666 | 3.525 |
| 0.8298611111111112 | 3.525 |
| 0.8305555555555556 | 3.525 |
| 0.8312499999999999 | 3.525 |
| 0.8319444444444444 | 3.525 |
| 0.8326388888888889 | 3.525 |
| 0.8333333333333334 | 3.525 |
| 0.8340277777777777 | 3.525 |
| 0.8347222222222223 | 3.525 |
| 0.8354166666666667 | 3.525 |
| 0.8361111111111111 | 0 |
| 0.8368055555555555 | 0 |
| 0.8375 | 0 |
| 0.8381944444444445 | 0 |
| 0.8388888888888889 | 0 |
| 0.8395833333333332 | 0 |
| 0.8402777777777778 | 0 |
| 0.8409722222222222 | 0 |
| 0.8416666666666667 | 0 |
| 0.842361111111111 | 0 |
| 0.8430555555555556 | 0 |
| 0.84375 | 0 |
| 0.8444444444444444 | 0 |
| 0.845138888888889 | 0 |
| 0.8458333333333333 | 0 |
| 0.8465277777777778 | 0 |
| 0.8472222222222222 | 0 |
| 0.8479166666666668 | 0 |
| 0.8486111111111111 | 0 |
| 0.8493055555555555 | 0 |
| 0.85 | 0 |
| 0.8506944444444445 | 0 |
| 0.8513888888888889 | 0 |
| 0.8520833333333333 | 0 |
| 0.8527777777777777 | 0 |
| 0.8534722222222223 | 0 |
| 0.8541666666666666 | 0 |
| 0.8548611111111111 | 0 |
| 0.8555555555555556 | 0 |
| 0.8562500000000001 | 0 |
| 0.8569444444444444 | 0 |
| 0.8576388888888888 | 0 |
| 0.8583333333333334 | 0 |
| 0.8590277777777778 | 0 |
| 0.8597222222222222 | 0 |
| 0.8604166666666666 | 0 |
| 0.8611111111111112 | 0 |
| 0.8618055555555556 | 0 |
| 0.8624999999999999 | 0 |
| 0.8631944444444444 | 0 |
| 0.8638888888888889 | 0 |
| 0.8645833333333334 | 0 |
| 0.8652777777777777 | 0 |
| 0.8659722222222223 | 0 |
| 0.8666666666666667 | 0 |
| 0.8673611111111111 | 0 |
| 0.8680555555555555 | 0 |
| 0.86875 | 0 |
| 0.8694444444444445 | 0 |
| 0.8701388888888889 | 0 |
| 0.8708333333333332 | 0 |
| 0.8715277777777778 | 0 |
| 0.8722222222222222 | 0 |
| 0.8729166666666667 | 0 |
| 0.873611111111111 | 0 |
| 0.8743055555555556 | 0 |
| 0.875 | 0 |
| 0.8756944444444444 | 0 |
| 0.876388888888889 | 0 |
| 0.8770833333333333 | 0 |
| 0.8777777777777778 | 0 |
| 0.8784722222222222 | 0 |
| 0.8791666666666668 | 0 |
| 0.8798611111111111 | 0 |
| 0.8805555555555555 | 0 |
| 0.88125 | 0 |
| 0.8819444444444445 | 0 |
| 0.8826388888888889 | 0 |
| 0.8833333333333333 | 0 |
| 0.8840277777777777 | 0 |
| 0.8847222222222223 | 0 |
| 0.8854166666666666 | 0 |
| 0.8861111111111111 | 0 |
| 0.8868055555555556 | 0 |
| 0.8875000000000001 | 0 |
| 0.8881944444444444 | 0 |
| 0.8888888888888888 | 0 |
| 0.8895833333333334 | 0 |
| 0.8902777777777778 | 0 |
| 0.8909722222222222 | 0 |
| 0.8916666666666666 | 0 |
| 0.8923611111111112 | 0 |
| 0.8930555555555556 | 0 |
| 0.8937499999999999 | 0 |
| 0.8944444444444444 | 0 |
| 0.8951388888888889 | 0 |
| 0.8958333333333334 | 0 |
| 0.8965277777777777 | 0 |
| 0.8972222222222223 | 0 |
| 0.8979166666666667 | 0 |
| 0.8986111111111111 | 0 |
| 0.8993055555555555 | 0 |
| 0.9 | 0 |
| 0.9006944444444445 | 0 |
| 0.9013888888888889 | 0 |
| 0.9020833333333332 | 0 |
| 0.9027777777777778 | 0 |
| 0.9034722222222222 | 0 |
| 0.9041666666666667 | 0 |
| 0.904861111111111 | 0 |
| 0.9055555555555556 | 0 |
| 0.90625 | 0 |
| 0.9069444444444444 | 0 |
| 0.907638888888889 | 0 |
| 0.9083333333333333 | 0 |
| 0.9090277777777778 | 0 |
| 0.9097222222222222 | 0 |
| 0.9104166666666668 | 0 |
| 0.9111111111111111 | 0 |
| 0.9118055555555555 | 0 |
| 0.9125 | 0 |
| 0.9131944444444445 | 0 |
| 0.9138888888888889 | 0 |
| 0.9145833333333333 | 0 |
| 0.9152777777777777 | 0 |
| 0.9159722222222223 | 0 |
| 0.9166666666666666 | 0 |
| 0.9173611111111111 | 0 |
| 0.9180555555555556 | 0 |
| 0.9187500000000001 | 0 |
| 0.9194444444444444 | 0 |
| 0.9201388888888888 | 0 |
| 0.9208333333333334 | 0 |
| 0.9215277777777778 | 0 |
| 0.9222222222222222 | 0 |
| 0.9229166666666666 | 0 |
| 0.9236111111111112 | 0 |
| 0.9243055555555556 | 0 |
| 0.9249999999999999 | 0 |
| 0.9256944444444444 | 0 |
| 0.9263888888888889 | 0 |
| 0.9270833333333334 | 0 |
| 0.9277777777777777 | 0 |
| 0.9284722222222223 | 0 |
| 0.9291666666666667 | 0 |
| 0.9298611111111111 | 0 |
| 0.9305555555555555 | 0 |
| 0.93125 | 0 |
| 0.9319444444444445 | 0 |
| 0.9326388888888889 | 0 |
| 0.9333333333333332 | 0 |
| 0.9340277777777778 | 0 |
| 0.9347222222222222 | 0 |
| 0.9354166666666667 | 0 |
| 0.936111111111111 | 0 |
| 0.9368055555555556 | 0 |
| 0.9375 | 0 |
| 0.9381944444444444 | 0 |
| 0.938888888888889 | 0 |
| 0.9395833333333333 | 0 |
| 0.9402777777777778 | 0 |
| 0.9409722222222222 | 0 |
| 0.9416666666666668 | 0 |
| 0.9423611111111111 | 0 |
| 0.9430555555555555 | 0 |
| 0.94375 | 0 |
| 0.9444444444444445 | 0 |
| 0.9451388888888889 | 0 |
| 0.9458333333333333 | 0 |
| 0.9465277777777777 | 0 |
| 0.9472222222222223 | 0 |
| 0.9479166666666666 | 0 |
| 0.9486111111111111 | 0 |
| 0.9493055555555556 | 0 |
| 0.9500000000000001 | 0 |
| 0.9506944444444444 | 0 |
| 0.9513888888888888 | 0 |
| 0.9520833333333334 | 0 |
| 0.9527777777777778 | 0 |
| 0.9534722222222222 | 0 |
| 0.9541666666666666 | 0 |
| 0.9548611111111112 | 0 |
| 0.9555555555555556 | 0 |
| 0.9562499999999999 | 0 |
| 0.9569444444444444 | 0 |
| 0.9576388888888889 | 0 |
| 0.9583333333333334 | 0 |
| 0.9590277777777777 | 0 |
| 0.9597222222222223 | 0 |
| 0.9604166666666667 | 0 |
| 0.9611111111111111 | 0 |
| 0.9618055555555555 | 0 |
| 0.9625 | 0 |
| 0.9631944444444445 | 0 |
| 0.9638888888888889 | 0 |
| 0.9645833333333332 | 0 |
| 0.9652777777777778 | 0 |
| 0.9659722222222222 | 0 |
| 0.9666666666666667 | 0 |
| 0.967361111111111 | 0 |
| 0.9680555555555556 | 0 |
| 0.96875 | 0 |
| 0.9694444444444444 | 0 |
| 0.970138888888889 | 0 |
| 0.9708333333333333 | 0 |
| 0.9715277777777778 | 0 |
| 0.9722222222222222 | 0 |
| 0.9729166666666668 | 0 |
| 0.9736111111111111 | 0 |
| 0.9743055555555555 | 0 |
| 0.975 | 0 |
| 0.9756944444444445 | 0 |
| 0.9763888888888889 | 0 |
| 0.9770833333333333 | 0 |
| 0.9777777777777777 | 0 |
| 0.9784722222222223 | 0 |
| 0.9791666666666666 | 0 |
| 0.9798611111111111 | 0 |
| 0.9805555555555556 | 0 |
| 0.9812500000000001 | 0 |
| 0.9819444444444444 | 0 |
| 0.9826388888888888 | 0 |
| 0.9833333333333334 | 0 |
| 0.9840277777777778 | 0 |
| 0.9847222222222222 | 0 |
| 0.9854166666666666 | 0 |
| 0.9861111111111112 | 0 |
| 0.9868055555555556 | 0 |
| 0.9874999999999999 | 0 |
| 0.9881944444444444 | 0 |
| 0.9888888888888889 | 0 |
| 0.9895833333333334 | 0 |
| 0.9902777777777777 | 0 |
| 0.9909722222222223 | 0 |
| 0.9916666666666667 | 0 |
| 0.9923611111111111 | 0 |
| 0.9930555555555555 | 0 |
| 0.99375 | 0 |
| 0.9944444444444445 | 0 |
| 0.9951388888888889 | 0 |
| 0.9958333333333332 | 0 |
| 0.9965277777777778 | 0 |
| 0.9972222222222222 | 0 |
| 0.9979166666666667 | 0 |
| 0.998611111111111 | 0 |
| 0.9993055555555556 | 0 |